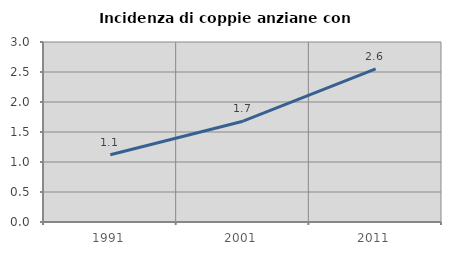
| Category | Incidenza di coppie anziane con figli |
|---|---|
| 1991.0 | 1.122 |
| 2001.0 | 1.68 |
| 2011.0 | 2.55 |